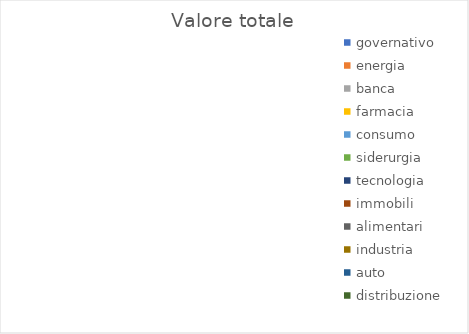
| Category | Valore totale |
|---|---|
| governativo | 0 |
| energia | 0 |
| banca | 0 |
| farmacia | 0 |
| consumo | 0 |
| siderurgia | 0 |
| tecnologia | 0 |
| immobili | 0 |
| alimentari | 0 |
| industria | 0 |
| auto | 0 |
| distribuzione | 0 |